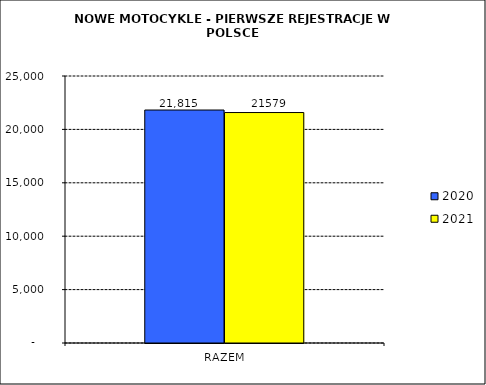
| Category | 2020 | 2021 |
|---|---|---|
| RAZEM | 21815 | 21579 |